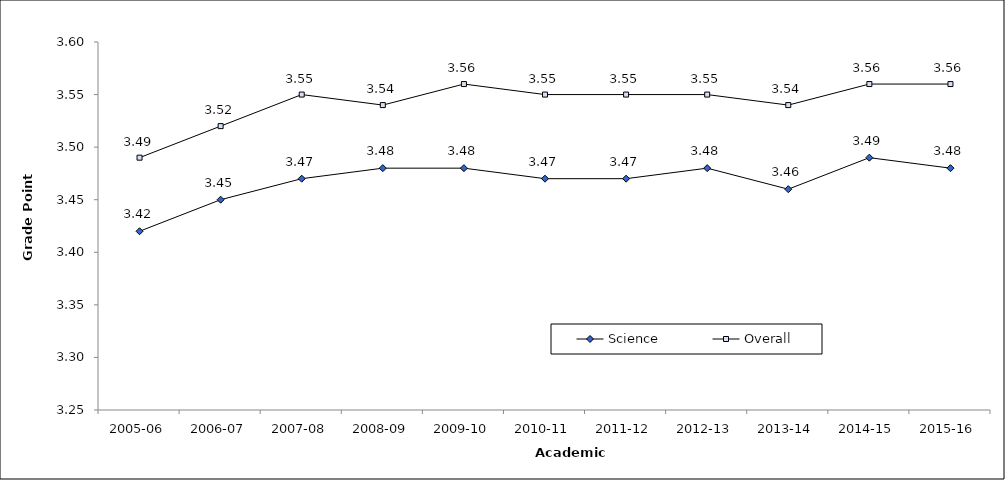
| Category | Science | Overall |
|---|---|---|
| 2005-06 | 3.42 | 3.49 |
| 2006-07 | 3.45 | 3.52 |
| 2007-08 | 3.47 | 3.55 |
| 2008-09 | 3.48 | 3.54 |
| 2009-10 | 3.48 | 3.56 |
| 2010-11 | 3.47 | 3.55 |
| 2011-12 | 3.47 | 3.55 |
| 2012-13 | 3.48 | 3.55 |
| 2013-14 | 3.46 | 3.54 |
| 2014-15 | 3.49 | 3.56 |
| 2015-16 | 3.48 | 3.56 |